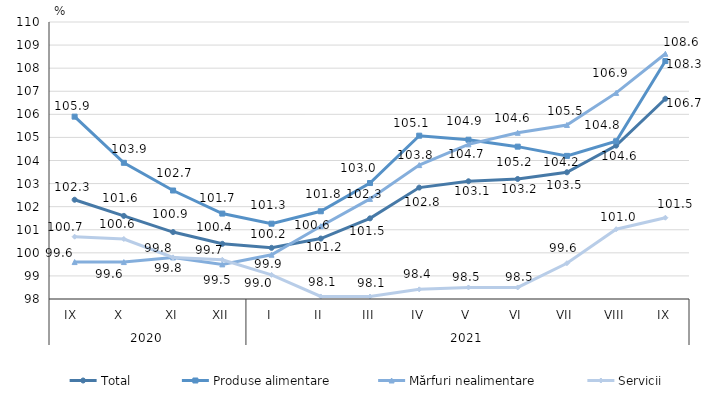
| Category | Total  | Produse alimentare | Mărfuri nealimentare  | Servicii |
|---|---|---|---|---|
| 0 | 102.3 | 105.9 | 99.6 | 100.7 |
| 1 | 101.6 | 103.9 | 99.6 | 100.6 |
| 2 | 100.9 | 102.7 | 99.8 | 99.8 |
| 3 | 100.39 | 101.7 | 99.5 | 99.7 |
| 4 | 100.216 | 101.263 | 99.917 | 99.046 |
| 5 | 100.619 | 101.8 | 101.154 | 98.109 |
| 6 | 101.493 | 103.024 | 102.337 | 98.107 |
| 7 | 102.826 | 105.075 | 103.801 | 98.417 |
| 8 | 103.1 | 104.9 | 104.7 | 98.5 |
| 9 | 103.2 | 104.6 | 105.2 | 98.5 |
| 10 | 103.49 | 104.2 | 105.54 | 99.55 |
| 11 | 104.645 | 104.834 | 106.928 | 101.023 |
| 12 | 106.675 | 108.308 | 108.624 | 101.521 |